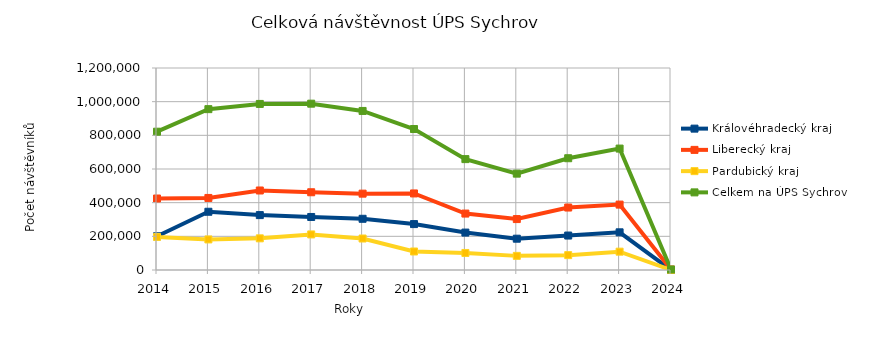
| Category | Královéhradecký kraj | Liberecký kraj | Pardubický kraj | Celkem na ÚPS Sychrov |
|---|---|---|---|---|
| 2014.0 | 200438 | 424718 | 196473 | 821629 |
| 2015.0 | 345970 | 428023 | 181567 | 955560 |
| 2016.0 | 326137 | 472318 | 188108 | 986563 |
| 2017.0 | 314983 | 461803 | 211268 | 988054 |
| 2018.0 | 304267 | 453568 | 187017 | 944852 |
| 2019.0 | 272720 | 454785 | 109949 | 837454 |
| 2020.0 | 222238 | 335261 | 101211 | 658710 |
| 2021.0 | 185934 | 302574 | 83925 | 572433 |
| 2022.0 | 204678 | 371041 | 88282 | 664001 |
| 2023.0 | 223799 | 388530 | 108959 | 721288 |
| 2024.0 | 2 | 2702 | 539 | 3243 |